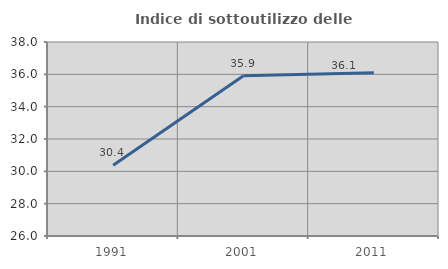
| Category | Indice di sottoutilizzo delle abitazioni  |
|---|---|
| 1991.0 | 30.376 |
| 2001.0 | 35.914 |
| 2011.0 | 36.094 |